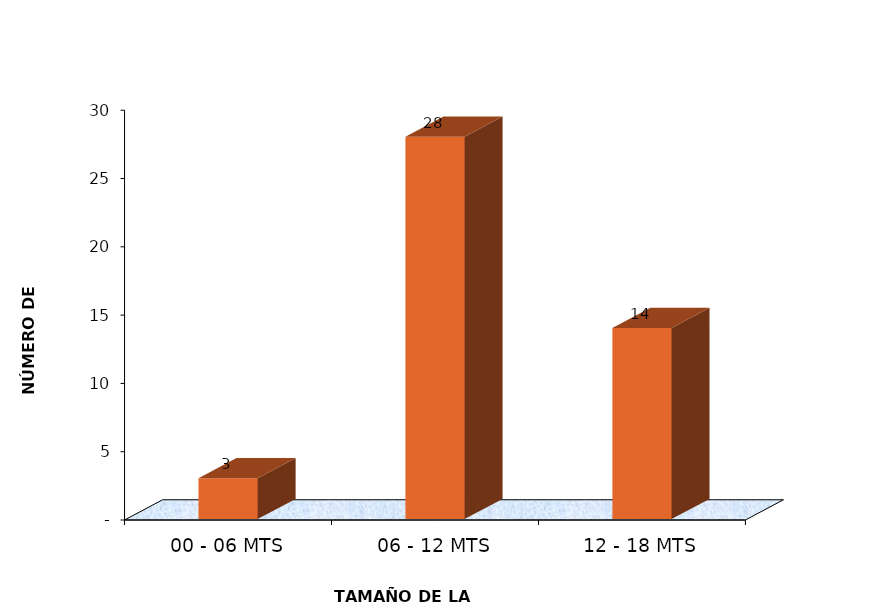
| Category | Series 0 |
|---|---|
| 00 - 06 MTS | 3 |
| 06 - 12 MTS | 28 |
| 12 - 18 MTS | 14 |